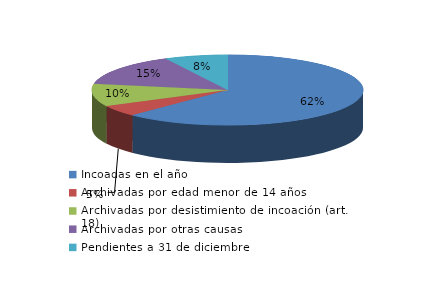
| Category | Series 0 |
|---|---|
| Incoadas en el año | 1456 |
| Archivadas por edad menor de 14 años | 121 |
| Archivadas por desistimiento de incoación (art. 18) | 243 |
| Archivadas por otras causas | 340 |
| Pendientes a 31 de diciembre | 176 |